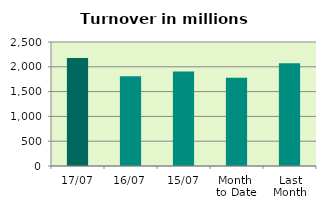
| Category | Series 0 |
|---|---|
| 17/07 | 2177.243 |
| 16/07 | 1810.32 |
| 15/07 | 1904.222 |
| Month 
to Date | 1779.914 |
| Last
Month | 2071.376 |